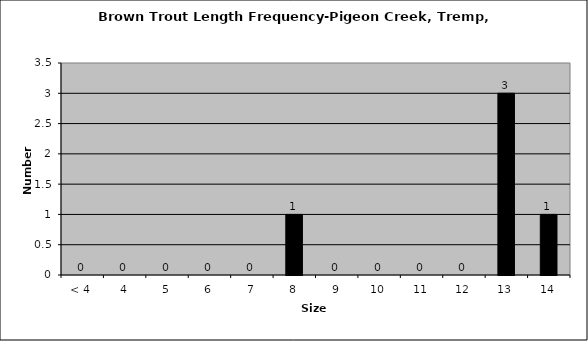
| Category | Series 0 |
|---|---|
| < 4 | 0 |
| 4 | 0 |
| 5 | 0 |
| 6 | 0 |
| 7 | 0 |
| 8 | 1 |
| 9 | 0 |
| 10 | 0 |
| 11 | 0 |
| 12 | 0 |
| 13 | 3 |
| 14 | 1 |